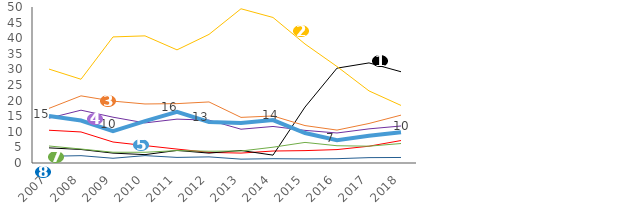
| Category | La santé (alimentation, SIDA, grippe et autres épidémies…) | L'environnement (pollution de l'air, pollution des sols, qualité de l'eau, …) | Le terrorisme, les attentats | Le chômage, la précarité de l'emploi | La délinquance | La pauvreté | La sécurité routière | Le racisme, la discrimination |
|---|---|---|---|---|---|---|---|---|
| 2007.0 | 14.36 | 10.5 | 4.85 | 30.1 | 15.07 | 17.51 | 2.16 | 5.45 |
| 2008.0 | 16.93 | 9.95 | 4.33 | 26.84 | 13.62 | 21.52 | 2.35 | 4.48 |
| 2009.0 | 14.68 | 6.73 | 3.17 | 40.41 | 10.21 | 19.83 | 1.52 | 3.45 |
| 2010.0 | 12.85 | 5.58 | 2.68 | 40.75 | 13.4 | 18.92 | 2.37 | 3.44 |
| 2011.0 | 14.06 | 4.46 | 4.03 | 36.26 | 16.38 | 19.03 | 1.79 | 3.98 |
| 2012.0 | 13.74 | 3.4 | 3.17 | 41.22 | 13.15 | 19.57 | 1.96 | 3.77 |
| 2013.0 | 10.83 | 3.18 | 4.02 | 49.43 | 12.84 | 14.62 | 1.24 | 3.85 |
| 2014.0 | 11.71 | 3.84 | 2.52 | 46.64 | 13.77 | 15.07 | 1.38 | 5.06 |
| 2015.0 | 10.46 | 3.97 | 17.93 | 38.14 | 9.61 | 11.99 | 1.3 | 6.6 |
| 2016.0 | 9.62 | 4.3 | 30.4 | 30.92 | 7.3 | 10.55 | 1.38 | 5.53 |
| 2017.0 | 10.94 | 5.38 | 32.08 | 23.11 | 8.71 | 12.67 | 1.72 | 5.39 |
| 2018.0 | 11.86 | 7.2 | 29.25 | 18.45 | 9.89 | 15.34 | 1.77 | 6.24 |